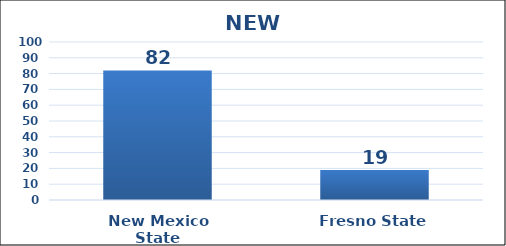
| Category | Series 0 |
|---|---|
| New Mexico State | 82 |
| Fresno State | 19 |